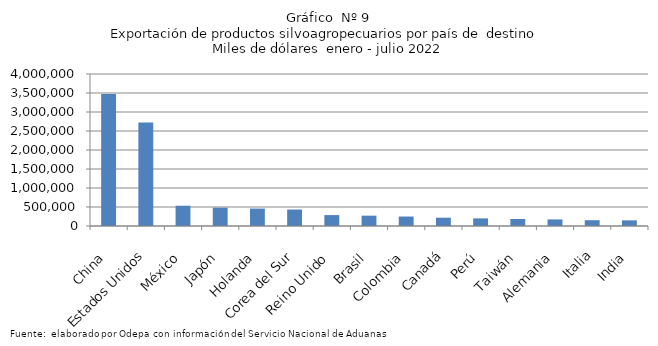
| Category | Series 0 |
|---|---|
| China | 3476462.617 |
| Estados Unidos | 2723496.697 |
| México | 533379.782 |
| Japón | 481606.331 |
| Holanda | 458537.388 |
| Corea del Sur | 433334.821 |
| Reino Unido | 287668.815 |
| Brasil | 271991.072 |
| Colombia | 248868.604 |
| Canadá | 218279.615 |
| Perú | 200250.589 |
| Taiwán | 183979.077 |
| Alemania | 173306.42 |
| Italia | 152517.445 |
| India | 148778.039 |